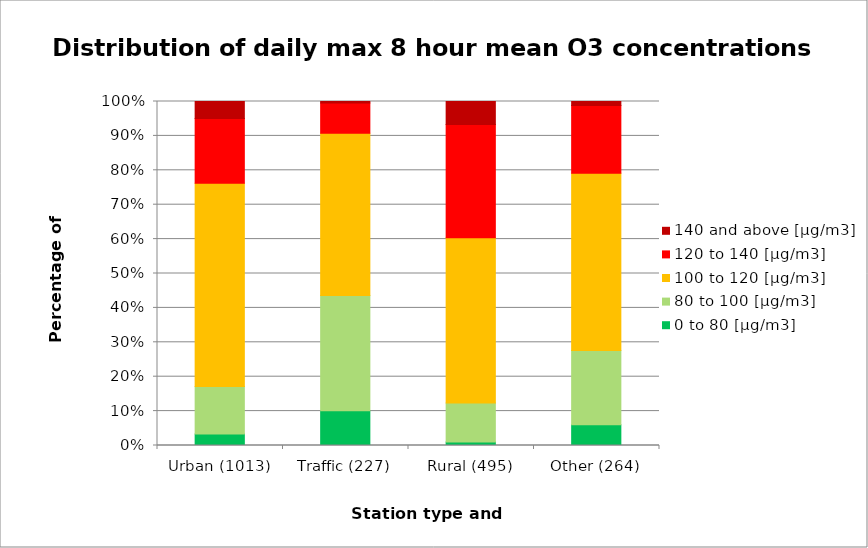
| Category | 0 to 80 [µg/m3] | 80 to 100 [µg/m3] | 100 to 120 [µg/m3] | 120 to 140 [µg/m3] | 140 and above [µg/m3] |
|---|---|---|---|---|---|
| Urban (1013) | 0.034 | 0.138 | 0.59 | 0.188 | 0.049 |
| Traffic (227) | 0.101 | 0.335 | 0.471 | 0.088 | 0.004 |
| Rural (495) | 0.01 | 0.113 | 0.481 | 0.329 | 0.067 |
| Other (264) | 0.061 | 0.216 | 0.515 | 0.197 | 0.011 |